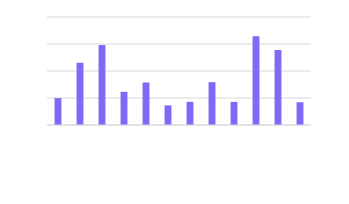
| Category | Current Year [%] |
|---|---|
| January | 0.05 |
| February | 0.115 |
| March | 0.148 |
| April | 0.061 |
| May | 0.079 |
| June | 0.036 |
| July | 0.043 |
| August | 0.079 |
| September | 0.043 |
| October | 0.164 |
| November | 0.139 |
| December | 0.042 |